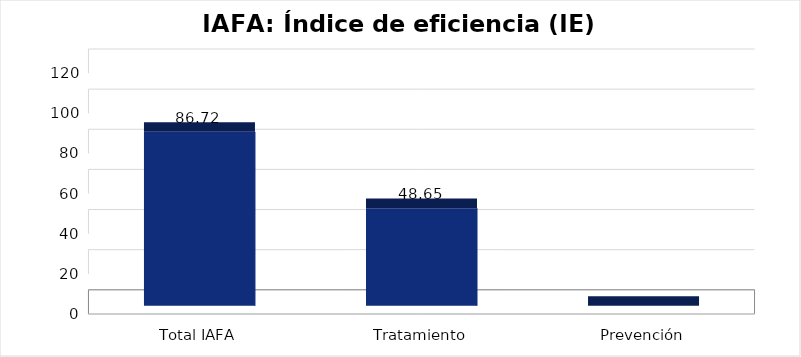
| Category | Índice de eficiencia (IE)  |
|---|---|
| Total IAFA | 86.723 |
| Tratamiento | 48.653 |
| Prevención | 0 |